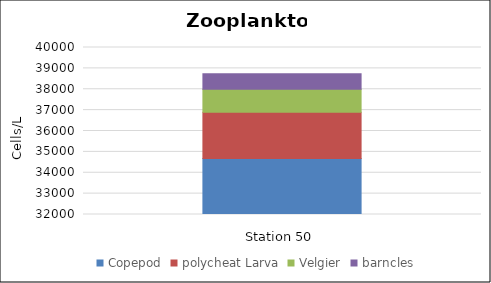
| Category | Copepod | polycheat Larva | Velgier | barncles |
|---|---|---|---|---|
| cells/L | 34681.228 | 2213.695 | 1106.848 | 737.898 |